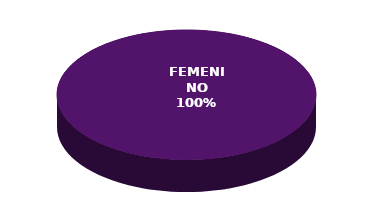
| Category | Series 0 |
|---|---|
| FEMENINO | 4 |